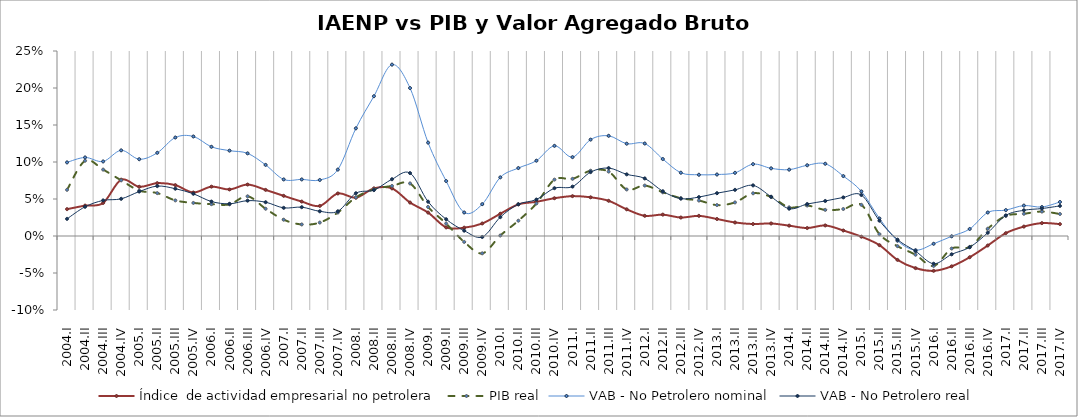
| Category | Índice  de actividad empresarial no petrolera | PIB real | VAB - No Petrolero nominal | VAB - No Petrolero real |
|---|---|---|---|---|
| 2004.I | 0.036 | 0.062 | 0.099 | 0.023 |
| 2004.II | 0.041 | 0.102 | 0.106 | 0.039 |
| 2004.III | 0.045 | 0.09 | 0.101 | 0.048 |
| 2004.IV | 0.076 | 0.075 | 0.116 | 0.05 |
| 2005.I | 0.066 | 0.061 | 0.104 | 0.06 |
| 2005.II | 0.071 | 0.058 | 0.112 | 0.067 |
| 2005.III | 0.069 | 0.048 | 0.133 | 0.064 |
| 2005.IV | 0.059 | 0.045 | 0.134 | 0.057 |
| 2006.I | 0.067 | 0.043 | 0.121 | 0.047 |
| 2006.II | 0.063 | 0.043 | 0.115 | 0.044 |
| 2006.III | 0.07 | 0.054 | 0.112 | 0.048 |
| 2006.IV | 0.062 | 0.037 | 0.096 | 0.046 |
| 2007.I | 0.054 | 0.022 | 0.076 | 0.038 |
| 2007.II | 0.047 | 0.016 | 0.076 | 0.039 |
| 2007.III | 0.041 | 0.018 | 0.076 | 0.033 |
| 2007.IV | 0.057 | 0.032 | 0.09 | 0.033 |
| 2008.I | 0.052 | 0.052 | 0.146 | 0.058 |
| 2008.II | 0.064 | 0.063 | 0.189 | 0.062 |
| 2008.III | 0.064 | 0.068 | 0.232 | 0.077 |
| 2008.IV | 0.045 | 0.071 | 0.2 | 0.085 |
| 2009.I | 0.032 | 0.039 | 0.126 | 0.046 |
| 2009.II | 0.012 | 0.017 | 0.074 | 0.023 |
| 2009.III | 0.011 | -0.008 | 0.032 | 0.007 |
| 2009.IV | 0.017 | -0.023 | 0.043 | -0.001 |
| 2010.I | 0.03 | 0.001 | 0.079 | 0.025 |
| 2010.II | 0.043 | 0.021 | 0.092 | 0.043 |
| 2010.III | 0.046 | 0.044 | 0.102 | 0.049 |
| 2010.IV | 0.051 | 0.076 | 0.122 | 0.065 |
| 2011.I | 0.054 | 0.077 | 0.107 | 0.067 |
| 2011.II | 0.052 | 0.088 | 0.13 | 0.086 |
| 2011.III | 0.048 | 0.087 | 0.135 | 0.092 |
| 2011.IV | 0.036 | 0.063 | 0.125 | 0.083 |
| 2012.I | 0.027 | 0.068 | 0.125 | 0.078 |
| 2012.II | 0.029 | 0.059 | 0.104 | 0.06 |
| 2012.III | 0.025 | 0.051 | 0.085 | 0.05 |
| 2012.IV | 0.027 | 0.048 | 0.083 | 0.053 |
| 2013.I | 0.023 | 0.042 | 0.083 | 0.058 |
| 2013.II | 0.018 | 0.045 | 0.085 | 0.062 |
| 2013.III | 0.016 | 0.058 | 0.097 | 0.068 |
| 2013.IV | 0.017 | 0.053 | 0.091 | 0.053 |
| 2014.I | 0.014 | 0.039 | 0.09 | 0.037 |
| 2014.II | 0.011 | 0.041 | 0.096 | 0.043 |
| 2014.III | 0.014 | 0.035 | 0.098 | 0.047 |
| 2014.IV | 0.007 | 0.036 | 0.081 | 0.052 |
| 2015.I | -0.001 | 0.042 | 0.06 | 0.055 |
| 2015.II | -0.012 | 0.002 | 0.024 | 0.021 |
| 2015.III | -0.032 | -0.014 | -0.006 | -0.005 |
| 2015.IV | -0.043 | -0.025 | -0.019 | -0.02 |
| 2016.I | -0.047 | -0.04 | -0.011 | -0.037 |
| 2016.II | -0.041 | -0.017 | 0 | -0.025 |
| 2016.III | -0.029 | -0.015 | 0.009 | -0.015 |
| 2016.IV | -0.013 | 0.01 | 0.032 | 0.004 |
| 2017.I | 0.004 | 0.027 | 0.035 | 0.028 |
| 2017.II | 0.013 | 0.03 | 0.041 | 0.035 |
| 2017.III | 0.017 | 0.033 | 0.039 | 0.037 |
| 2017.IV | 0.016 | 0.03 | 0.046 | 0.041 |